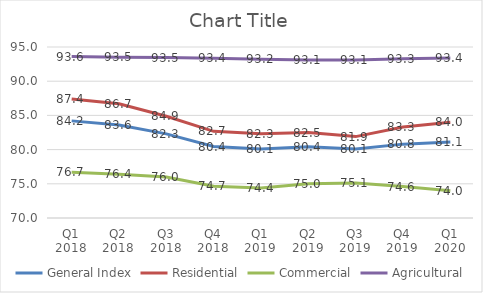
| Category | General Index | Residential | Commercial | Agricultural |
|---|---|---|---|---|
| Q1 2018 | 84.2 | 87.4 | 76.7 | 93.6 |
| Q2 2018 | 83.6 | 86.7 | 76.4 | 93.5 |
| Q3 2018 | 82.3 | 84.883 | 76 | 93.45 |
| Q4 2018 | 80.443 | 82.67 | 74.65 | 93.37 |
| Q1 2019 | 80.1 | 82.3 | 74.4 | 93.2 |
| Q2 2019 | 80.4 | 82.5 | 75 | 93.1 |
| Q3 2019 | 80.1 | 81.9 | 75.1 | 93.1 |
| Q4 2019 | 80.8 | 83.3 | 74.6 | 93.3 |
| Q1 2020 | 81.1 | 84 | 74 | 93.4 |